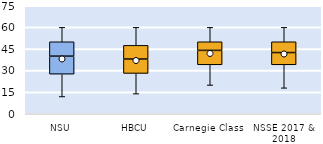
| Category | 25th | 50th | 75th |
|---|---|---|---|
| NSU | 27.5 | 12.5 | 10 |
| HBCU | 28 | 10 | 9.5 |
| Carnegie Class | 34 | 10 | 6 |
| NSSE 2017 & 2018 | 34 | 8.5 | 7.5 |